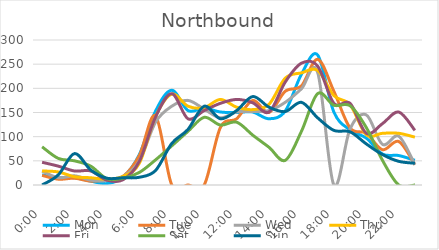
| Category | Mon | Tue | Wed | Thu | Fri | Sat | Sun |
|---|---|---|---|---|---|---|---|
| 0.0 | 21 | 20 | 29 | 29 | 47 | 79 | 0 |
| 0.041667 | 15 | 12 | 15 | 27 | 39 | 55 | 21 |
| 0.083333 | 15 | 14 | 19 | 17 | 29 | 50 | 65 |
| 0.125 | 8 | 8 | 10 | 15 | 29 | 39 | 31 |
| 0.166667 | 3 | 11 | 9 | 12 | 10 | 13 | 14 |
| 0.208333 | 16 | 18 | 18 | 18 | 11 | 14 | 15 |
| 0.25 | 63 | 61 | 50 | 45 | 49 | 26 | 16 |
| 0.291667 | 153 | 143 | 130 | 142 | 141 | 52 | 30 |
| 0.333333 | 196 | 0 | 163 | 188 | 189 | 81 | 86 |
| 0.375 | 154 | 0 | 175 | 163 | 137 | 111 | 115 |
| 0.416667 | 159 | 0 | 157 | 160 | 154 | 140 | 163 |
| 0.458333 | 151 | 119 | 139 | 177 | 169 | 124 | 137 |
| 0.5 | 150 | 137 | 151 | 161 | 177 | 130 | 154 |
| 0.541667 | 151 | 175 | 152 | 156 | 170 | 103 | 183 |
| 0.5833333333333334 | 137 | 150 | 154 | 167 | 151 | 78 | 161 |
| 0.625 | 153 | 194 | 171 | 221 | 213 | 51 | 152 |
| 0.666667 | 229 | 205 | 199 | 232 | 252 | 111 | 171 |
| 0.708333 | 269 | 260 | 233 | 237 | 246 | 189 | 139 |
| 0.75 | 151 | 194 | 0 | 185 | 169 | 165 | 113 |
| 0.791667 | 114 | 118 | 116 | 166 | 169 | 164 | 110 |
| 0.833333 | 97 | 107 | 145 | 104 | 107 | 119 | 85 |
| 0.875 | 64 | 73 | 84 | 107 | 127 | 51 | 63 |
| 0.916667 | 61 | 90 | 101 | 107 | 151 | 0 | 49 |
| 0.958333 | 51 | 42 | 42 | 99 | 113 | 0 | 45 |